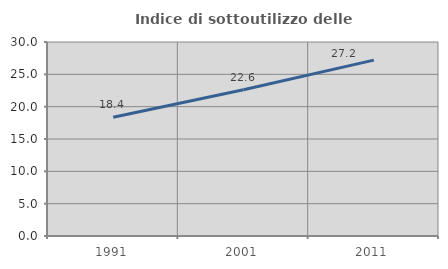
| Category | Indice di sottoutilizzo delle abitazioni  |
|---|---|
| 1991.0 | 18.361 |
| 2001.0 | 22.604 |
| 2011.0 | 27.201 |